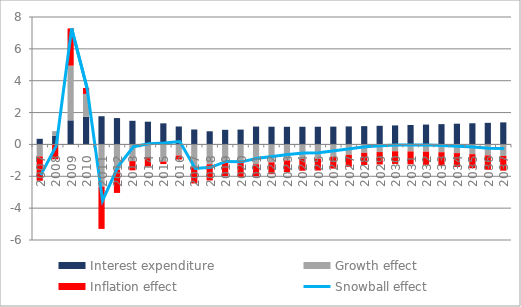
| Category | Interest expenditure | Growth effect | Inflation effect |
|---|---|---|---|
| 0 | 0.353 | -0.754 | -1.527 |
| 1 | 0.551 | 0.285 | -0.933 |
| 2 | 1.511 | 3.434 | 2.337 |
| 3 | 1.731 | 1.442 | 0.368 |
| 4 | 1.77 | -2.65 | -2.655 |
| 5 | 1.655 | -1.594 | -1.45 |
| 6 | 1.483 | -1.047 | -0.579 |
| 7 | 1.428 | -0.798 | -0.585 |
| 8 | 1.324 | -1.075 | -0.157 |
| 9 | 1.127 | -0.694 | -0.255 |
| 10 | 0.938 | -1.39 | -1.06 |
| 11 | 0.825 | -1.245 | -1.018 |
| 12 | 0.918 | -1.135 | -0.853 |
| 13 | 0.933 | -1.17 | -0.858 |
| 14 | 1.121 | -1.245 | -0.748 |
| 15 | 1.112 | -1.126 | -0.742 |
| 16 | 1.108 | -1.003 | -0.739 |
| 17 | 1.109 | -0.912 | -0.739 |
| 18 | 1.111 | -0.898 | -0.74 |
| 19 | 1.118 | -0.774 | -0.745 |
| 20 | 1.131 | -0.651 | -0.754 |
| 21 | 1.148 | -0.528 | -0.766 |
| 22 | 1.169 | -0.479 | -0.78 |
| 23 | 1.194 | -0.43 | -0.796 |
| 24 | 1.219 | -0.439 | -0.813 |
| 25 | 1.246 | -0.453 | -0.831 |
| 26 | 1.274 | -0.488 | -0.849 |
| 27 | 1.301 | -0.547 | -0.868 |
| 28 | 1.329 | -0.611 | -0.886 |
| 29 | 1.356 | -0.687 | -0.904 |
| 30 | 1.383 | -0.724 | -0.922 |